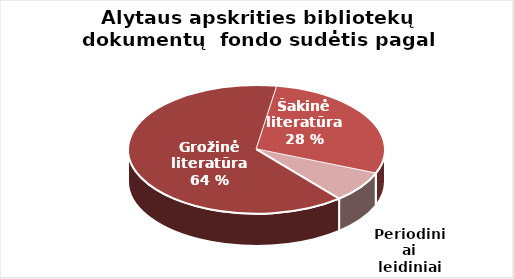
| Category | Series 0 |
|---|---|
| Grožinė literatūra* | 611638 |
| Šakinė literatūra* | 273927 |
| period. | 74783 |